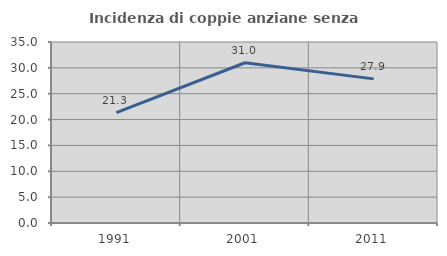
| Category | Incidenza di coppie anziane senza figli  |
|---|---|
| 1991.0 | 21.348 |
| 2001.0 | 30.986 |
| 2011.0 | 27.869 |